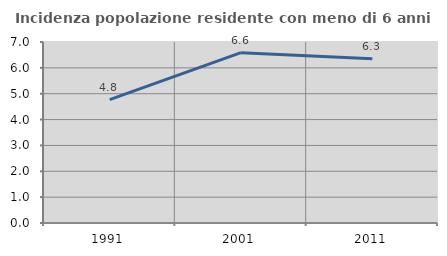
| Category | Incidenza popolazione residente con meno di 6 anni |
|---|---|
| 1991.0 | 4.769 |
| 2001.0 | 6.589 |
| 2011.0 | 6.349 |